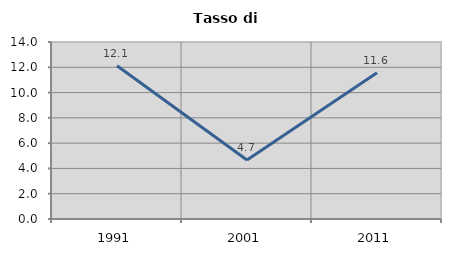
| Category | Tasso di disoccupazione   |
|---|---|
| 1991.0 | 12.128 |
| 2001.0 | 4.665 |
| 2011.0 | 11.562 |